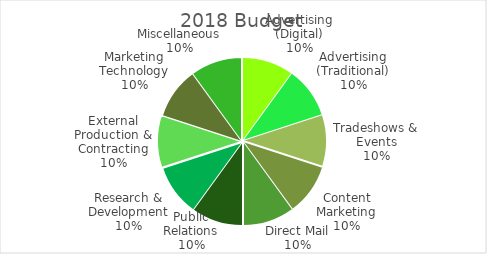
| Category | Series 0 |
|---|---|
| Advertising (Digital) | 300 |
| Advertising (Traditional) | 300 |
| Tradeshows & Events | 300 |
| Content Marketing | 300 |
| Direct Mail | 300 |
| Public Relations | 300 |
| Research & Development | 300 |
| External Production & Contracting | 300 |
| Marketing Technology | 300 |
| Miscellaneous | 300 |